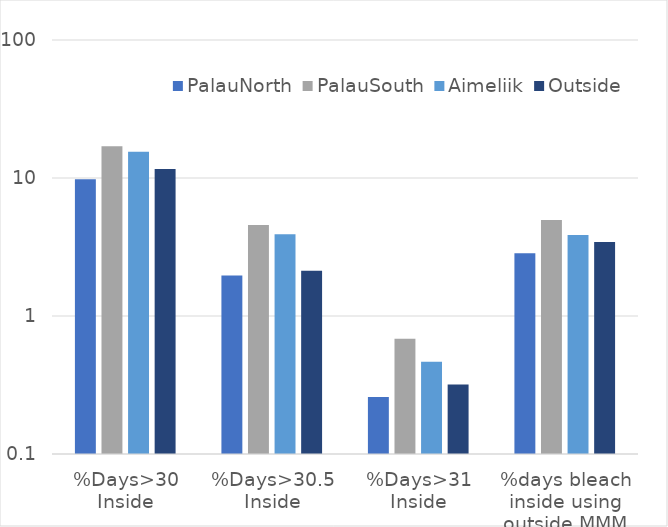
| Category | PalauNorth | PalauSouth | Aimeliik | Outside |
|---|---|---|---|---|
| %Days>30 Inside | 9.793 | 17.016 | 15.494 | 11.603 |
| %Days>30.5 Inside | 1.962 | 4.562 | 3.914 | 2.129 |
| %Days>31 Inside | 0.259 | 0.684 | 0.467 | 0.319 |
| %days bleach inside using outside MMM | 2.844 | 4.957 | 3.865 | 3.437 |